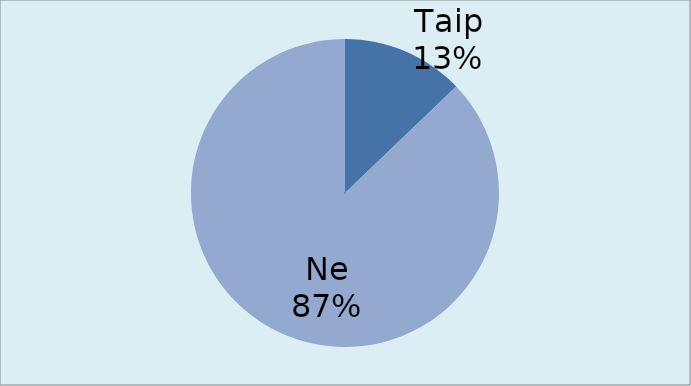
| Category | Series 0 |
|---|---|
| Taip | 14 |
| Ne | 95 |